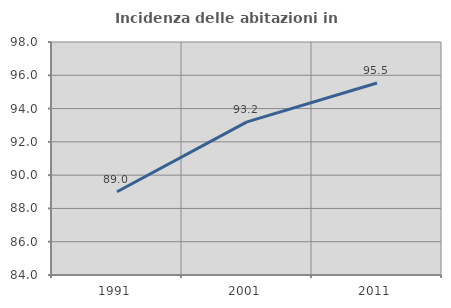
| Category | Incidenza delle abitazioni in proprietà  |
|---|---|
| 1991.0 | 89 |
| 2001.0 | 93.204 |
| 2011.0 | 95.536 |